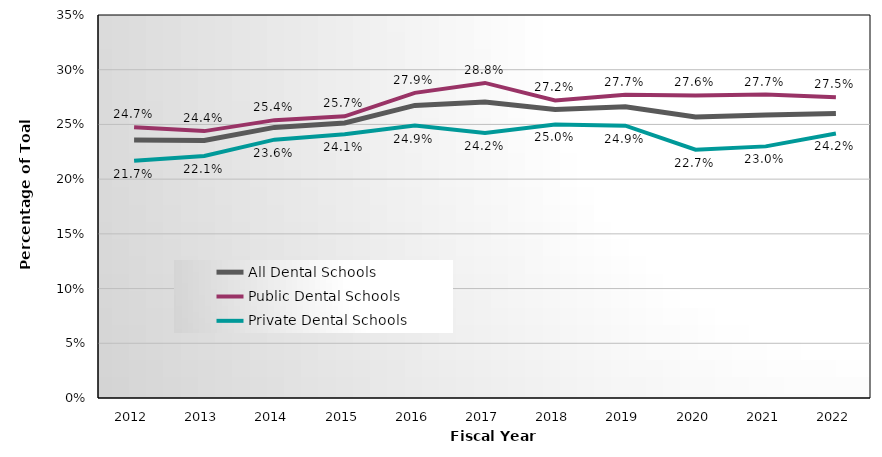
| Category | All Dental Schools | Public Dental Schools | Private Dental Schools |
|---|---|---|---|
| 2012.0 | 0.236 | 0.247 | 0.217 |
| 2013.0 | 0.235 | 0.244 | 0.221 |
| 2014.0 | 0.247 | 0.254 | 0.236 |
| 2015.0 | 0.251 | 0.257 | 0.241 |
| 2016.0 | 0.267 | 0.279 | 0.249 |
| 2017.0 | 0.271 | 0.288 | 0.242 |
| 2018.0 | 0.264 | 0.272 | 0.25 |
| 2019.0 | 0.266 | 0.277 | 0.249 |
| 2020.0 | 0.257 | 0.276 | 0.227 |
| 2021.0 | 0.259 | 0.277 | 0.23 |
| 2022.0 | 0.26 | 0.275 | 0.242 |